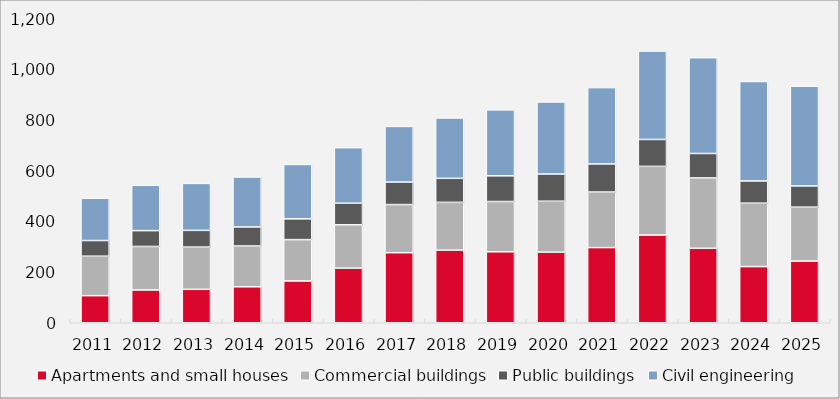
| Category | Apartments and small houses | Commercial buildings | Public buildings | Civil engineering |
|---|---|---|---|---|
| 2011.0 | 106.96 | 155.776 | 61.865 | 167.016 |
| 2012.0 | 129.497 | 171.617 | 62.564 | 178.965 |
| 2013.0 | 131.883 | 166.854 | 65.943 | 185.394 |
| 2014.0 | 142.024 | 160.958 | 75.2 | 197.228 |
| 2015.0 | 164.995 | 163.187 | 82.062 | 214.658 |
| 2016.0 | 215.558 | 171.102 | 85.187 | 219.346 |
| 2017.0 | 276.549 | 189.987 | 88.9 | 219.632 |
| 2018.0 | 286.601 | 188.695 | 94.845 | 238.343 |
| 2019.0 | 280.173 | 198.445 | 101.457 | 260.267 |
| 2020.0 | 278.68 | 201.042 | 107.33 | 284.532 |
| 2021.0 | 296.801 | 219.225 | 110.757 | 301.584 |
| 2022.0 | 346.294 | 270.997 | 106.217 | 349.225 |
| 2023.0 | 293.912 | 277.745 | 96.51 | 378.254 |
| 2024.0 | 221.701 | 250.363 | 87.619 | 392.695 |
| 2025.0 | 243.441 | 212.968 | 83.721 | 393.874 |